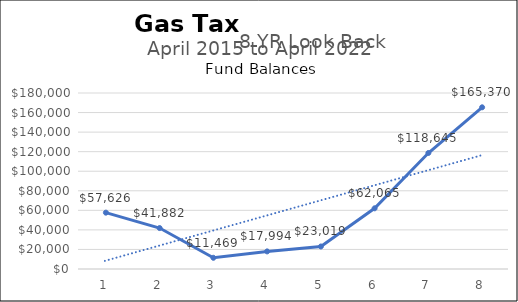
| Category | Gas Tax |
|---|---|
| 0 | 57625.83 |
| 1 | 41881.98 |
| 2 | 11469.14 |
| 3 | 17993.85 |
| 4 | 23019.23 |
| 5 | 62064.93 |
| 6 | 118644.81 |
| 7 | 165369.69 |